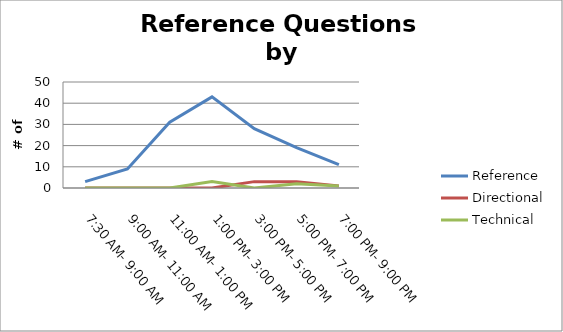
| Category | Reference | Directional | Technical |
|---|---|---|---|
| 7:30 AM- 9:00 AM | 3 | 0 | 0 |
| 9:00 AM- 11:00 AM | 9 | 0 | 0 |
| 11:00 AM- 1:00 PM | 31 | 0 | 0 |
| 1:00 PM- 3:00 PM | 43 | 0 | 3 |
| 3:00 PM- 5:00 PM | 28 | 3 | 0 |
| 5:00 PM- 7:00 PM | 19 | 3 | 2 |
| 7:00 PM- 9:00 PM | 11 | 1 | 1 |